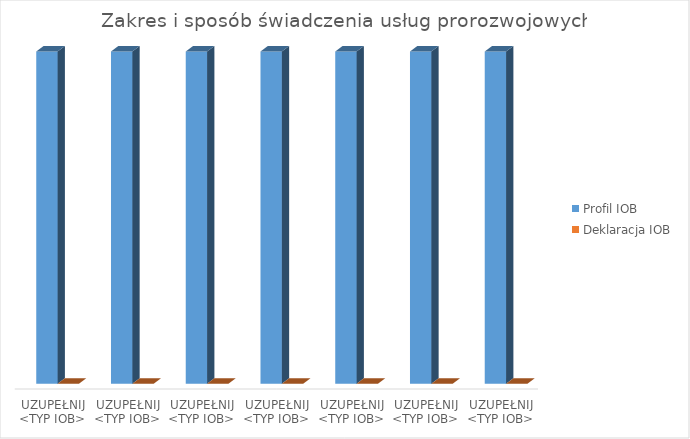
| Category | Profil IOB | Deklaracja IOB |
|---|---|---|
| UZUPEŁNIJ <TYP IOB> | 1 | 0 |
| UZUPEŁNIJ <TYP IOB> | 1 | 0 |
| UZUPEŁNIJ <TYP IOB> | 1 | 0 |
| UZUPEŁNIJ <TYP IOB> | 1 | 0 |
| UZUPEŁNIJ <TYP IOB> | 1 | 0 |
| UZUPEŁNIJ <TYP IOB> | 1 | 0 |
| UZUPEŁNIJ <TYP IOB> | 1 | 0 |